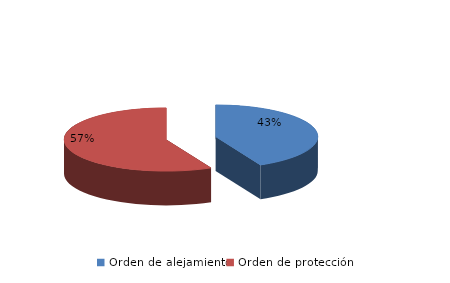
| Category | Series 0 |
|---|---|
| Orden de alejamiento | 59 |
| Orden de protección | 79 |